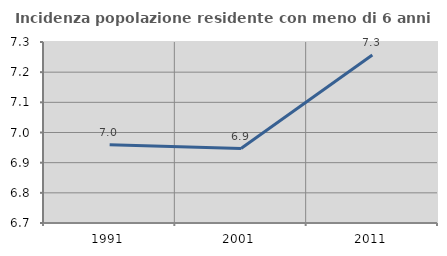
| Category | Incidenza popolazione residente con meno di 6 anni |
|---|---|
| 1991.0 | 6.959 |
| 2001.0 | 6.947 |
| 2011.0 | 7.257 |